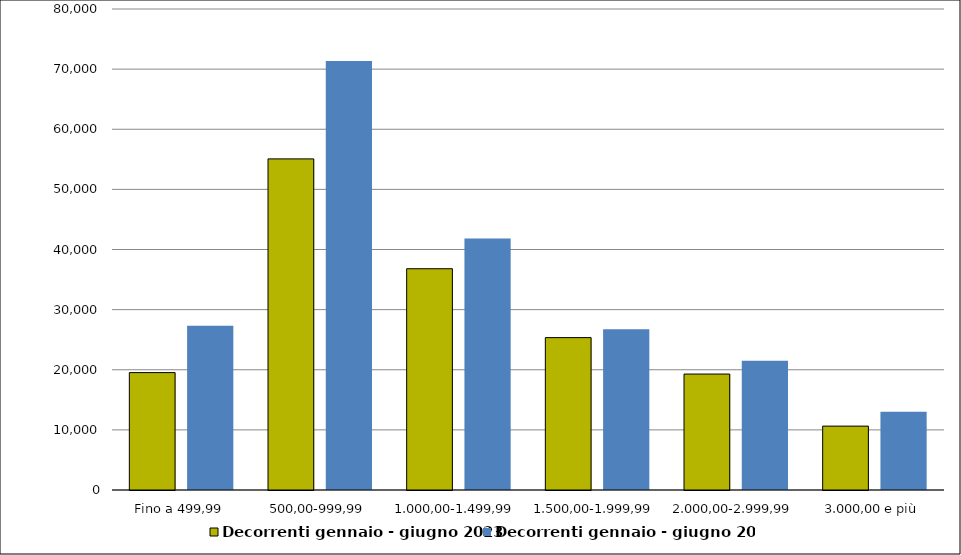
| Category | Decorrenti gennaio - giugno 2023 | Decorrenti gennaio - giugno 2022 |
|---|---|---|
|  Fino a 499,99  | 19527 | 27313 |
|  500,00-999,99  | 55071 | 71347 |
|  1.000,00-1.499,99  | 36801 | 41836 |
|  1.500,00-1.999,99  | 25345 | 26722 |
|  2.000,00-2.999,99  | 19283 | 21501 |
|  3.000,00 e più  | 10625 | 13019 |